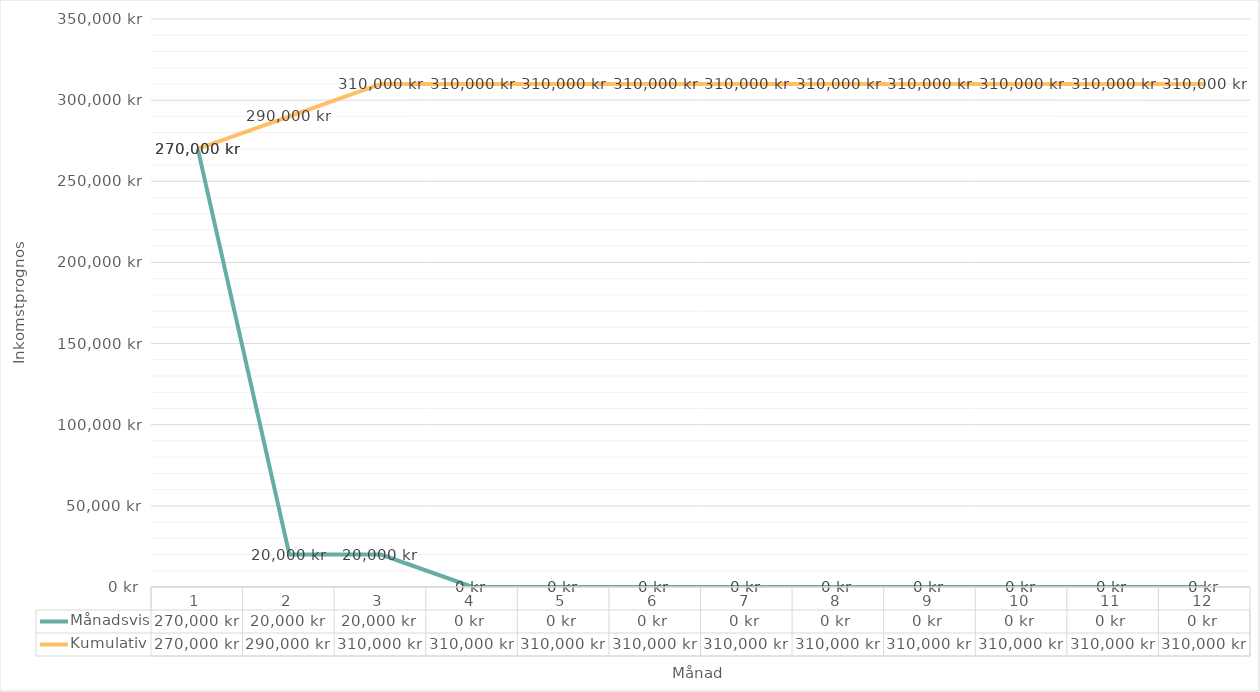
| Category | Månadsvis | Kumulativ |
|---|---|---|
| 0 | 270000 | 270000 |
| 1 | 20000 | 290000 |
| 2 | 20000 | 310000 |
| 3 | 0 | 310000 |
| 4 | 0 | 310000 |
| 5 | 0 | 310000 |
| 6 | 0 | 310000 |
| 7 | 0 | 310000 |
| 8 | 0 | 310000 |
| 9 | 0 | 310000 |
| 10 | 0 | 310000 |
| 11 | 0 | 310000 |